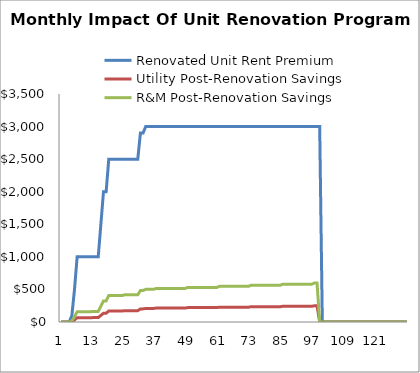
| Category | Renovated Unit Rent Premium | Utility Post-Renovation Savings | R&M Post-Renovation Savings |
|---|---|---|---|
| 0 | 0 | 0 | 0 |
| 1 | 0 | 0 | 0 |
| 2 | 0 | 0 | 0 |
| 3 | 0 | 0 | 0 |
| 4 | 100 | 6.545 | 15.739 |
| 5 | 500 | 32.726 | 78.694 |
| 6 | 1000 | 65.452 | 157.388 |
| 7 | 1000 | 65.452 | 157.388 |
| 8 | 1000 | 65.452 | 157.388 |
| 9 | 1000 | 65.452 | 157.388 |
| 10 | 1000 | 65.452 | 157.388 |
| 11 | 1000 | 65.452 | 157.388 |
| 12 | 1000 | 67.415 | 162.109 |
| 13 | 1000 | 67.415 | 162.109 |
| 14 | 1000 | 67.415 | 162.109 |
| 15 | 1500 | 101.123 | 243.164 |
| 16 | 2000 | 134.831 | 324.219 |
| 17 | 2000 | 134.831 | 324.219 |
| 18 | 2500 | 168.539 | 405.274 |
| 19 | 2500 | 168.539 | 405.274 |
| 20 | 2500 | 168.539 | 405.274 |
| 21 | 2500 | 168.539 | 405.274 |
| 22 | 2500 | 168.539 | 405.274 |
| 23 | 2500 | 168.539 | 405.274 |
| 24 | 2500 | 173.595 | 417.432 |
| 25 | 2500 | 173.595 | 417.432 |
| 26 | 2500 | 173.595 | 417.432 |
| 27 | 2500 | 173.595 | 417.432 |
| 28 | 2500 | 173.595 | 417.432 |
| 29 | 2500 | 173.595 | 417.432 |
| 30 | 2900 | 201.37 | 484.221 |
| 31 | 2900 | 201.37 | 484.221 |
| 32 | 3000 | 208.314 | 500.918 |
| 33 | 3000 | 208.314 | 500.918 |
| 34 | 3000 | 208.314 | 500.918 |
| 35 | 3000 | 208.314 | 500.918 |
| 36 | 3000 | 214.563 | 515.946 |
| 37 | 3000 | 214.563 | 515.946 |
| 38 | 3000 | 214.563 | 515.946 |
| 39 | 3000 | 214.563 | 515.946 |
| 40 | 3000 | 214.563 | 515.946 |
| 41 | 3000 | 214.563 | 515.946 |
| 42 | 3000 | 214.563 | 515.946 |
| 43 | 3000 | 214.563 | 515.946 |
| 44 | 3000 | 214.563 | 515.946 |
| 45 | 3000 | 214.563 | 515.946 |
| 46 | 3000 | 214.563 | 515.946 |
| 47 | 3000 | 214.563 | 515.946 |
| 48 | 3000 | 221 | 531.424 |
| 49 | 3000 | 221 | 531.424 |
| 50 | 3000 | 221 | 531.424 |
| 51 | 3000 | 221 | 531.424 |
| 52 | 3000 | 221 | 531.424 |
| 53 | 3000 | 221 | 531.424 |
| 54 | 3000 | 221 | 531.424 |
| 55 | 3000 | 221 | 531.424 |
| 56 | 3000 | 221 | 531.424 |
| 57 | 3000 | 221 | 531.424 |
| 58 | 3000 | 221 | 531.424 |
| 59 | 3000 | 221 | 531.424 |
| 60 | 3000 | 227.63 | 547.367 |
| 61 | 3000 | 227.63 | 547.367 |
| 62 | 3000 | 227.63 | 547.367 |
| 63 | 3000 | 227.63 | 547.367 |
| 64 | 3000 | 227.63 | 547.367 |
| 65 | 3000 | 227.63 | 547.367 |
| 66 | 3000 | 227.63 | 547.367 |
| 67 | 3000 | 227.63 | 547.367 |
| 68 | 3000 | 227.63 | 547.367 |
| 69 | 3000 | 227.63 | 547.367 |
| 70 | 3000 | 227.63 | 547.367 |
| 71 | 3000 | 227.63 | 547.367 |
| 72 | 3000 | 234.459 | 563.788 |
| 73 | 3000 | 234.459 | 563.788 |
| 74 | 3000 | 234.459 | 563.788 |
| 75 | 3000 | 234.459 | 563.788 |
| 76 | 3000 | 234.459 | 563.788 |
| 77 | 3000 | 234.459 | 563.788 |
| 78 | 3000 | 234.459 | 563.788 |
| 79 | 3000 | 234.459 | 563.788 |
| 80 | 3000 | 234.459 | 563.788 |
| 81 | 3000 | 234.459 | 563.788 |
| 82 | 3000 | 234.459 | 563.788 |
| 83 | 3000 | 234.459 | 563.788 |
| 84 | 3000 | 241.493 | 580.702 |
| 85 | 3000 | 241.493 | 580.702 |
| 86 | 3000 | 241.493 | 580.702 |
| 87 | 3000 | 241.493 | 580.702 |
| 88 | 3000 | 241.493 | 580.702 |
| 89 | 3000 | 241.493 | 580.702 |
| 90 | 3000 | 241.493 | 580.702 |
| 91 | 3000 | 241.493 | 580.702 |
| 92 | 3000 | 241.493 | 580.702 |
| 93 | 3000 | 241.493 | 580.702 |
| 94 | 3000 | 241.493 | 580.702 |
| 95 | 3000 | 241.493 | 580.702 |
| 96 | 3000 | 248.738 | 598.123 |
| 97 | 3000 | 248.738 | 598.123 |
| 98 | 3000 | 0 | 0 |
| 99 | 0 | 0 | 0 |
| 100 | 0 | 0 | 0 |
| 101 | 0 | 0 | 0 |
| 102 | 0 | 0 | 0 |
| 103 | 0 | 0 | 0 |
| 104 | 0 | 0 | 0 |
| 105 | 0 | 0 | 0 |
| 106 | 0 | 0 | 0 |
| 107 | 0 | 0 | 0 |
| 108 | 0 | 0 | 0 |
| 109 | 0 | 0 | 0 |
| 110 | 0 | 0 | 0 |
| 111 | 0 | 0 | 0 |
| 112 | 0 | 0 | 0 |
| 113 | 0 | 0 | 0 |
| 114 | 0 | 0 | 0 |
| 115 | 0 | 0 | 0 |
| 116 | 0 | 0 | 0 |
| 117 | 0 | 0 | 0 |
| 118 | 0 | 0 | 0 |
| 119 | 0 | 0 | 0 |
| 120 | 0 | 0 | 0 |
| 121 | 0 | 0 | 0 |
| 122 | 0 | 0 | 0 |
| 123 | 0 | 0 | 0 |
| 124 | 0 | 0 | 0 |
| 125 | 0 | 0 | 0 |
| 126 | 0 | 0 | 0 |
| 127 | 0 | 0 | 0 |
| 128 | 0 | 0 | 0 |
| 129 | 0 | 0 | 0 |
| 130 | 0 | 0 | 0 |
| 131 | 0 | 0 | 0 |